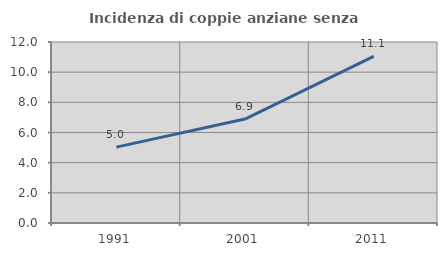
| Category | Incidenza di coppie anziane senza figli  |
|---|---|
| 1991.0 | 5.03 |
| 2001.0 | 6.889 |
| 2011.0 | 11.053 |